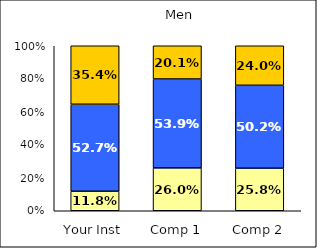
| Category | Low Academic Self-Concept | Average Academic Self-Concept | High Academic Self-Concept |
|---|---|---|---|
| Your Inst | 0.118 | 0.527 | 0.354 |
| Comp 1 | 0.26 | 0.539 | 0.201 |
| Comp 2 | 0.258 | 0.502 | 0.24 |